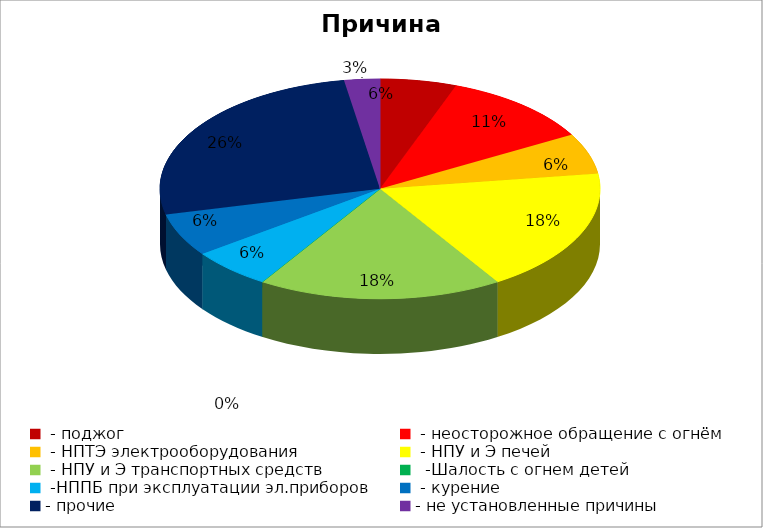
| Category | Причина пожара |
|---|---|
|  - поджог | 15 |
|  - неосторожное обращение с огнём | 30 |
|  - НПТЭ электрооборудования | 16 |
|  - НПУ и Э печей | 49 |
|  - НПУ и Э транспортных средств | 48 |
|   -Шалость с огнем детей | 0 |
|  -НППБ при эксплуатации эл.приборов | 16 |
|  - курение | 17 |
| - прочие | 70 |
| - не установленные причины | 7 |